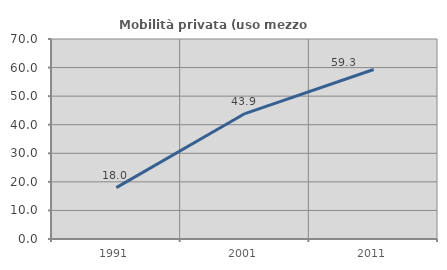
| Category | Mobilità privata (uso mezzo privato) |
|---|---|
| 1991.0 | 17.986 |
| 2001.0 | 43.902 |
| 2011.0 | 59.322 |